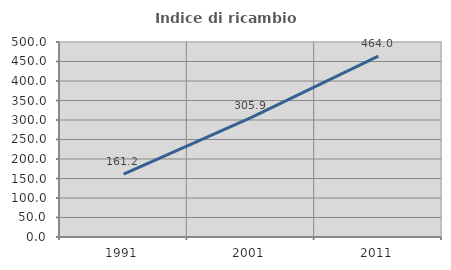
| Category | Indice di ricambio occupazionale  |
|---|---|
| 1991.0 | 161.207 |
| 2001.0 | 305.882 |
| 2011.0 | 464 |